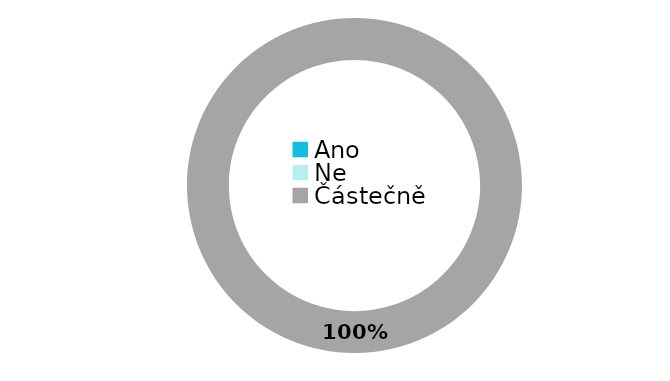
| Category | Series 0 |
|---|---|
| Ano | 0 |
| Ne | 0 |
| Částečně | 54 |